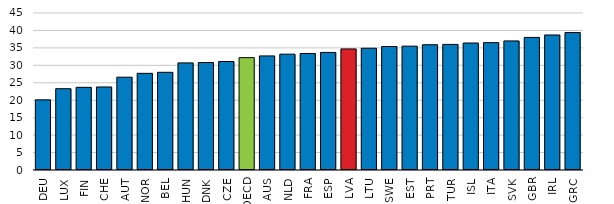
| Category | Field-of-study mismatch |
|---|---|
| DEU | 20.1 |
| LUX | 23.3 |
| FIN | 23.7 |
| CHE | 23.8 |
| AUT | 26.6 |
| NOR | 27.7 |
| BEL | 28 |
| HUN | 30.7 |
| DNK | 30.8 |
| CZE | 31.1 |
| OECD | 32.2 |
| AUS | 32.7 |
| NLD | 33.2 |
| FRA | 33.4 |
| ESP | 33.7 |
| LVA | 34.7 |
| LTU | 34.9 |
| SWE | 35.4 |
| EST | 35.5 |
| PRT | 35.9 |
| TUR | 36 |
| ISL | 36.4 |
| ITA | 36.5 |
| SVK | 37 |
| GBR | 38 |
| IRL | 38.7 |
| GRC | 39.4 |